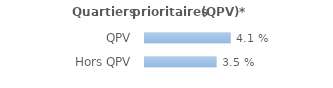
| Category | Series 0 |
|---|---|
| QPV | 0.041 |
| Hors QPV | 0.035 |